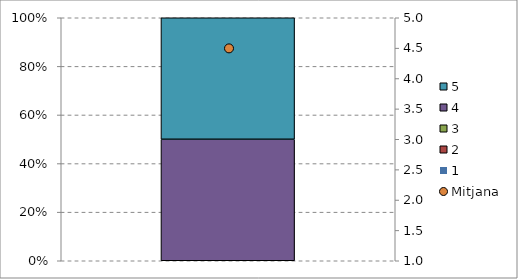
| Category | 1 | 2 | 3 | 4 | 5 |
|---|---|---|---|---|---|
| 0 | 0 | 0 | 0 | 0.5 | 0.5 |